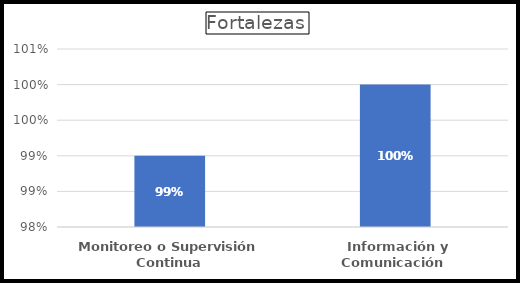
| Category | Series 0 |
|---|---|
| Monitoreo o Supervisión Continua | 0.99 |
|  Información y Comunicación  | 1 |